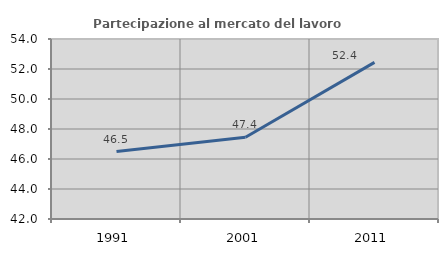
| Category | Partecipazione al mercato del lavoro  femminile |
|---|---|
| 1991.0 | 46.5 |
| 2001.0 | 47.449 |
| 2011.0 | 52.444 |